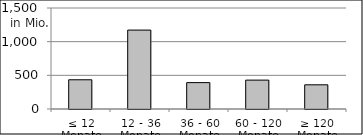
| Category | Volumen |
|---|---|
| ≤ 12 Monate | 434008383.65 |
| 12 - 36 Monate | 1172079726.53 |
| 36 - 60 Monate | 391920393.54 |
| 60 - 120 Monate | 429029451.11 |
| ≥ 120 Monate | 359349771.642 |